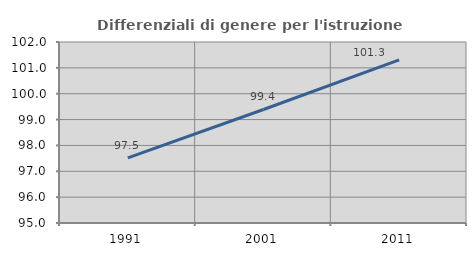
| Category | Differenziali di genere per l'istruzione superiore |
|---|---|
| 1991.0 | 97.521 |
| 2001.0 | 99.391 |
| 2011.0 | 101.31 |